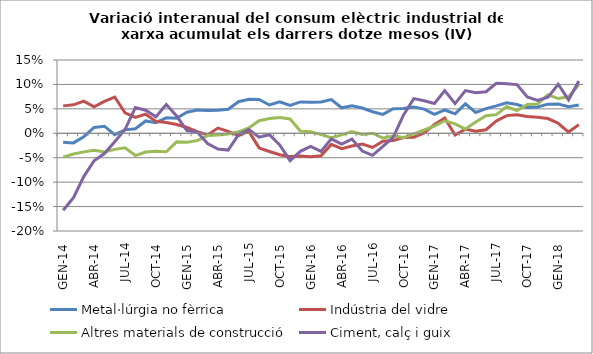
| Category | Metal·lúrgia no fèrrica | Indústria del vidre | Altres materials de construcció | Ciment, calç i guix |
|---|---|---|---|---|
| GEN-14 | -0.018 | 0.056 | -0.049 | -0.158 |
| FEB-14 | -0.02 | 0.058 | -0.043 | -0.132 |
| MAR-14 | -0.007 | 0.066 | -0.038 | -0.089 |
| ABR-14 | 0.012 | 0.054 | -0.035 | -0.056 |
| MAI-14 | 0.014 | 0.065 | -0.038 | -0.042 |
| JUN-14 | -0.003 | 0.074 | -0.033 | -0.017 |
| JUL-14 | 0.007 | 0.042 | -0.03 | 0.008 |
| AGO-14 | 0.009 | 0.032 | -0.046 | 0.053 |
| SET-14 | 0.025 | 0.039 | -0.038 | 0.047 |
| OCT-14 | 0.022 | 0.024 | -0.037 | 0.034 |
| NOV-14 | 0.032 | 0.022 | -0.038 | 0.059 |
| DES-14 | 0.031 | 0.018 | -0.017 | 0.035 |
| GEN-15 | 0.043 | 0.012 | -0.019 | 0.005 |
| FEB-15 | 0.047 | 0.003 | -0.015 | 0.003 |
| MAR-15 | 0.047 | -0.003 | -0.005 | -0.021 |
| ABR-15 | 0.047 | 0.011 | -0.004 | -0.032 |
| MAI-15 | 0.049 | 0.004 | -0.002 | -0.034 |
| JUN-15 | 0.065 | -0.005 | 0.003 | -0.003 |
| JUL-15 | 0.07 | 0.004 | 0.011 | 0.008 |
| AGO-15 | 0.069 | -0.03 | 0.026 | -0.008 |
| SET-15 | 0.058 | -0.037 | 0.03 | -0.003 |
| OCT-15 | 0.064 | -0.044 | 0.033 | -0.024 |
| NOV-15 | 0.057 | -0.048 | 0.029 | -0.056 |
| DES-15 | 0.064 | -0.046 | 0.005 | -0.037 |
| GEN-16 | 0.064 | -0.048 | 0.003 | -0.027 |
| FEB-16 | 0.064 | -0.046 | -0.003 | -0.037 |
| MAR-16 | 0.069 | -0.023 | -0.009 | -0.012 |
| ABR-16 | 0.052 | -0.031 | -0.003 | -0.022 |
| MAI-16 | 0.056 | -0.026 | 0.003 | -0.012 |
| JUN-16 | 0.052 | -0.022 | -0.002 | -0.036 |
| JUL-16 | 0.044 | -0.029 | 0 | -0.045 |
| AGO-16 | 0.039 | -0.016 | -0.01 | -0.027 |
| SET-16 | 0.05 | -0.015 | -0.006 | -0.009 |
| OCT-16 | 0.051 | -0.009 | -0.009 | 0.038 |
| NOV-16 | 0.054 | -0.008 | -0.001 | 0.071 |
| DES-16 | 0.049 | 0.001 | 0.007 | 0.067 |
| GEN-17 | 0.039 | 0.018 | 0.015 | 0.061 |
| FEB-17 | 0.048 | 0.031 | 0.026 | 0.087 |
| MAR-17 | 0.04 | -0.003 | 0.019 | 0.061 |
| ABR-17 | 0.06 | 0.009 | 0.009 | 0.087 |
| MAI-17 | 0.043 | 0.004 | 0.023 | 0.083 |
| JUN-17 | 0.051 | 0.007 | 0.036 | 0.085 |
| JUL-17 | 0.056 | 0.025 | 0.038 | 0.102 |
| AGO-17 | 0.062 | 0.036 | 0.055 | 0.102 |
| SET-17 | 0.059 | 0.038 | 0.047 | 0.1 |
| OCT-17 | 0.053 | 0.035 | 0.059 | 0.075 |
| NOV-17 | 0.054 | 0.033 | 0.06 | 0.067 |
| DES-17 | 0.06 | 0.03 | 0.079 | 0.074 |
| GEN-18 | 0.06 | 0.021 | 0.071 | 0.1 |
| FEB-18 | 0.054 | 0.002 | 0.075 | 0.068 |
| MAR-18 | 0.058 | 0.018 | 0.099 | 0.107 |